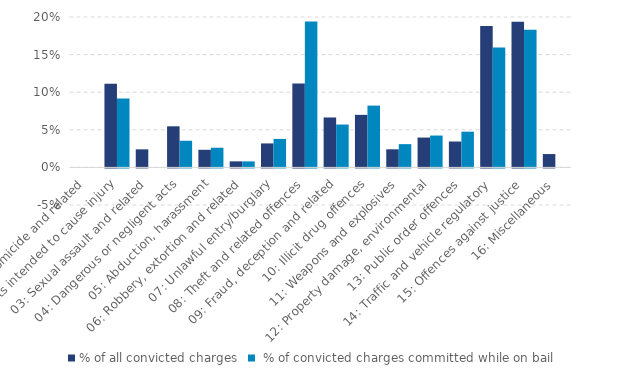
| Category | % of all convicted charges |  % of convicted charges committed while on bail |
|---|---|---|
| 01: Homicide and related | 0 | 0 |
| 02: Acts intended to cause injury | 0.111 | 0.092 |
| 03: Sexual assault and related | 0.024 | 0 |
| 04: Dangerous or negligent acts | 0.055 | 0.035 |
| 05: Abduction, harassment | 0.023 | 0.026 |
| 06: Robbery, extortion and related | 0.008 | 0.008 |
| 07: Unlawful entry/burglary | 0.032 | 0.038 |
| 08: Theft and related offences | 0.111 | 0.194 |
| 09: Fraud, deception and related | 0.066 | 0.057 |
| 10: Illicit drug offences | 0.07 | 0.082 |
| 11: Weapons and explosives | 0.024 | 0.031 |
| 12: Property damage, environmental | 0.04 | 0.042 |
| 13: Public order offences | 0.034 | 0.047 |
| 14: Traffic and vehicle regulatory | 0.188 | 0.159 |
| 15: Offences against justice | 0.194 | 0.183 |
| 16: Miscellaneous | 0.018 | 0 |